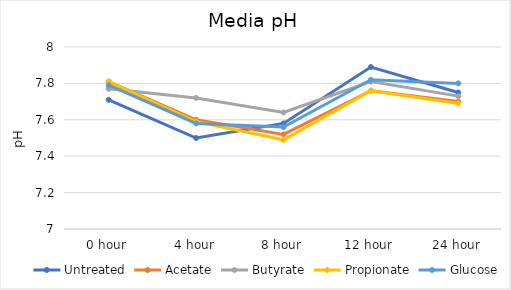
| Category | Untreated | Acetate | Butyrate | Propionate | Glucose |
|---|---|---|---|---|---|
| 0 hour | 7.71 | 7.81 | 7.77 | 7.81 | 7.79 |
| 4 hour | 7.5 | 7.6 | 7.72 | 7.59 | 7.58 |
| 8 hour | 7.58 | 7.52 | 7.64 | 7.49 | 7.56 |
| 12 hour | 7.89 | 7.76 | 7.81 | 7.76 | 7.82 |
| 24 hour | 7.75 | 7.7 | 7.73 | 7.69 | 7.8 |